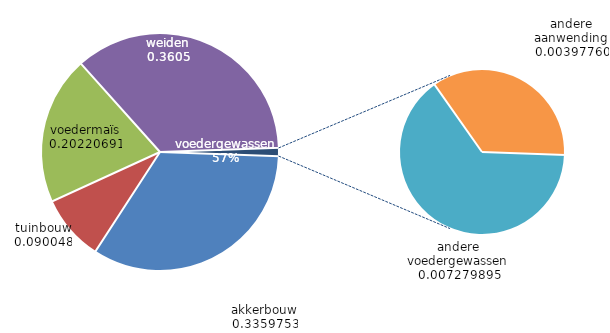
| Category | Series 0 |
|---|---|
| akkerbouw | 207957 |
| tuinbouw | 55737 |
| voedermaïs | 125159 |
| weiden | 223144 |
| andere voedergewassen | 4506 |
| andere aanwending | 2462 |